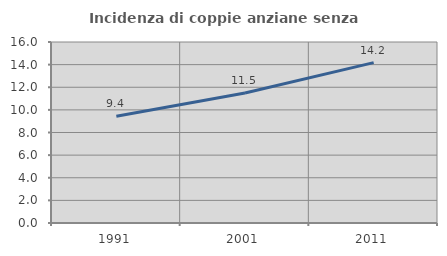
| Category | Incidenza di coppie anziane senza figli  |
|---|---|
| 1991.0 | 9.444 |
| 2001.0 | 11.498 |
| 2011.0 | 14.179 |